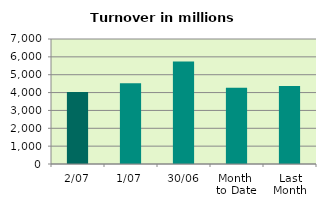
| Category | Series 0 |
|---|---|
| 2/07 | 4025.488 |
| 1/07 | 4527.138 |
| 30/06 | 5737.081 |
| Month 
to Date | 4276.313 |
| Last
Month | 4366.67 |